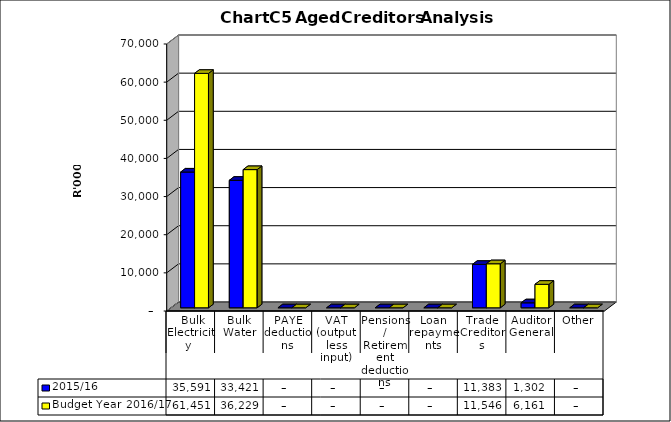
| Category | 2015/16 | Budget Year 2016/17 |
|---|---|---|
|  Bulk Electricity  | 35591279 | 61450984.79 |
| Bulk Water | 33420804 | 36228534.12 |
| PAYE deductions | 0 | 0 |
| VAT (output less input) | 0 | 0 |
| Pensions / Retirement deductions | 0 | 0 |
| Loan repayments | 0 | 0 |
| Trade Creditors | 11383068 | 11546316.28 |
| Auditor General | 1302092 | 6160563.79 |
| Other | 0 | 0 |